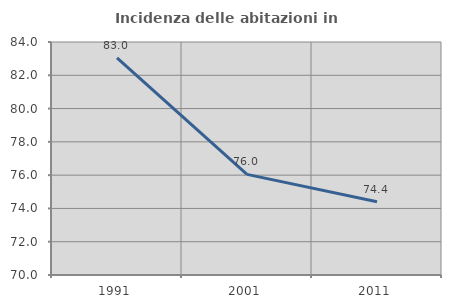
| Category | Incidenza delle abitazioni in proprietà  |
|---|---|
| 1991.0 | 83.041 |
| 2001.0 | 76.048 |
| 2011.0 | 74.405 |